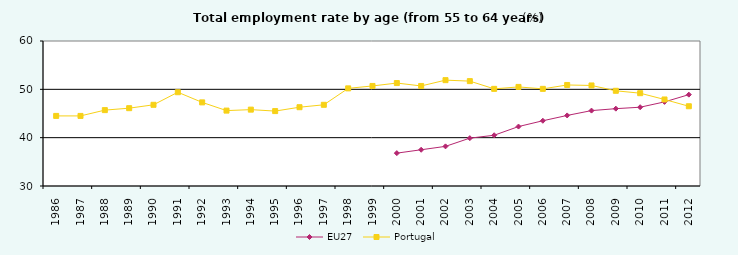
| Category | EU27 | Portugal |
|---|---|---|
| 1986 | 0 | 44.5 |
| 1987 | 0 | 44.5 |
| 1988 | 0 | 45.7 |
| 1989 | 0 | 46.1 |
| 1990 | 0 | 46.8 |
| 1991 | 0 | 49.4 |
| 1992 | 0 | 47.3 |
| 1993 | 0 | 45.6 |
| 1994 | 0 | 45.8 |
| 1995 | 0 | 45.5 |
| 1996 | 0 | 46.3 |
| 1997 | 0 | 46.8 |
| 1998 | 0 | 50.2 |
| 1999 | 0 | 50.7 |
| 2000 | 36.8 | 51.3 |
| 2001 | 37.5 | 50.7 |
| 2002 | 38.2 | 51.9 |
| 2003 | 39.9 | 51.7 |
| 2004 | 40.5 | 50.1 |
| 2005 | 42.3 | 50.5 |
| 2006 | 43.5 | 50.1 |
| 2007 | 44.6 | 50.9 |
| 2008 | 45.6 | 50.8 |
| 2009 | 46 | 49.7 |
| 2010 | 46.3 | 49.2 |
| 2011 | 47.4 | 47.9 |
| 2012 | 48.9 | 46.5 |